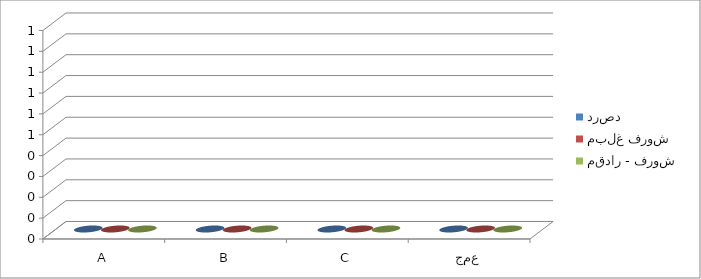
| Category | درصد  | مبلغ فروش  | مقدار - فروش  |
|---|---|---|---|
| A | 0 | 0 | 0 |
| B | 0 | 0 | 0 |
| C | 0 | 0 | 0 |
| جمع | 0 | 0 | 0 |